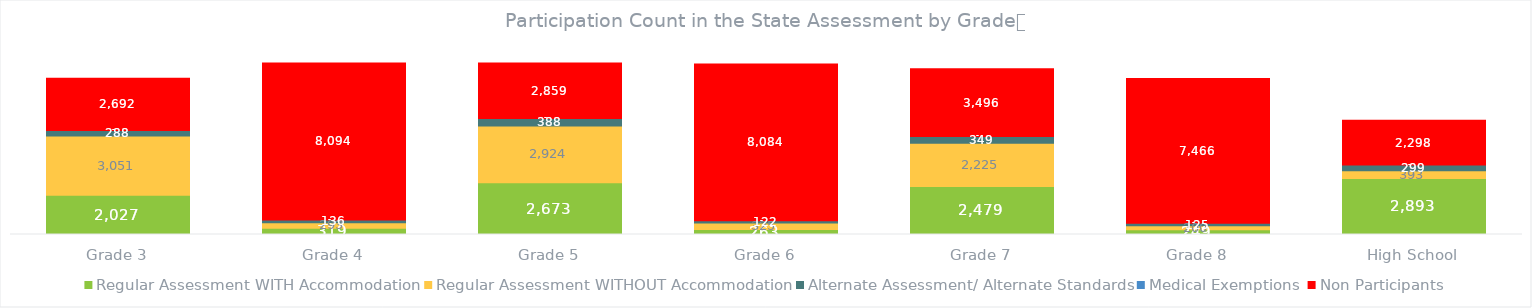
| Category | Regular Assessment WITH Accommodation | Regular Assessment WITHOUT Accommodation | Alternate Assessment/ Alternate Standards | Medical Exemptions | Non Participants |
|---|---|---|---|---|---|
| Grade 3 | 2027 | 3051 | 288 | 0 | 2692 |
| Grade 4 | 319 | 293 | 136 | 0 | 8094 |
| Grade 5 | 2673 | 2924 | 388 | 0 | 2859 |
| Grade 6 | 263 | 325 | 122 | 0 | 8084 |
| Grade 7 | 2479 | 2225 | 349 | 0 | 3496 |
| Grade 8 | 249 | 200 | 125 | 0 | 7466 |
| High School | 2893 | 393 | 299 | 0 | 2298 |